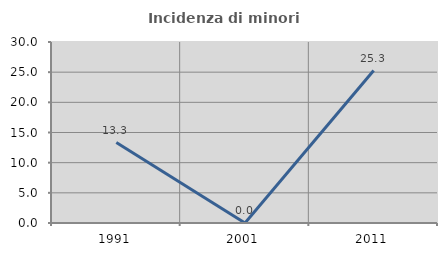
| Category | Incidenza di minori stranieri |
|---|---|
| 1991.0 | 13.333 |
| 2001.0 | 0 |
| 2011.0 | 25.263 |